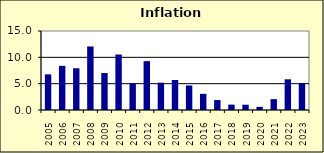
| Category | 4.0 |
|---|---|
| 2005.0 | 6.769 |
| 2006.0 | 8.384 |
| 2007.0 | 7.925 |
| 2008.0 | 12.063 |
| 2009.0 | 7.02 |
| 2010.0 | 10.537 |
| 2011.0 | 5.091 |
| 2012.0 | 9.28 |
| 2013.0 | 5.189 |
| 2014.0 | 5.698 |
| 2015.0 | 4.659 |
| 2016.0 | 3.069 |
| 2017.0 | 1.884 |
| 2018.0 | 1.019 |
| 2019.0 | 1.001 |
| 2020.0 | 0.599 |
| 2021.0 | 2.061 |
| 2022.0 | 5.826 |
| 2023.0 | 5.1 |